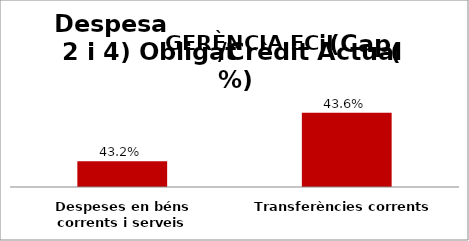
| Category | Series 0 |
|---|---|
| Despeses en béns corrents i serveis | 0.432 |
| Transferències corrents | 0.436 |